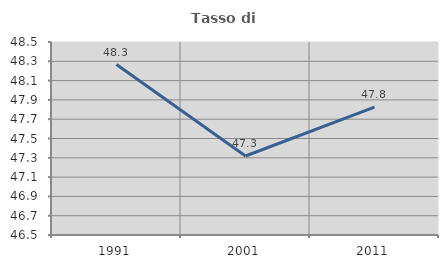
| Category | Tasso di occupazione   |
|---|---|
| 1991.0 | 48.266 |
| 2001.0 | 47.319 |
| 2011.0 | 47.826 |